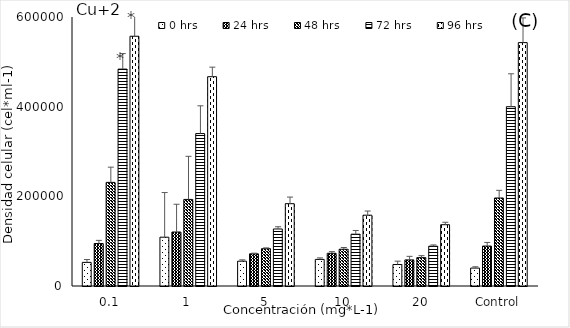
| Category | 0 hrs | 24 hrs | 48 hrs | 72 hrs | 96 hrs |
|---|---|---|---|---|---|
| 0,1 | 52688.666 | 94746.568 | 231106.376 | 483740.287 | 557093.44 |
| 1 | 108849.219 | 120428.802 | 193093.45 | 340003.016 | 466833.5 |
| 5 | 55333.137 | 71756.962 | 83167.373 | 127175.266 | 183600.472 |
| 10 | 59321.934 | 72958.274 | 81984.046 | 115517.817 | 157945.566 |
| 20 | 47920.008 | 58235.183 | 63244.35 | 88739.409 | 136710.689 |
| Control | 39973.247 | 89096.419 | 196296.75 | 399945.559 | 542881.195 |